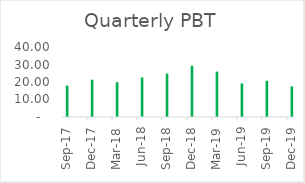
| Category | Profit before tax |
|---|---|
| 2017-09-30 | 17.93 |
| 2017-12-31 | 21.34 |
| 2018-03-31 | 19.86 |
| 2018-06-30 | 22.64 |
| 2018-09-30 | 24.74 |
| 2018-12-31 | 29.27 |
| 2019-03-31 | 25.93 |
| 2019-06-30 | 19.14 |
| 2019-09-30 | 20.69 |
| 2019-12-31 | 17.49 |